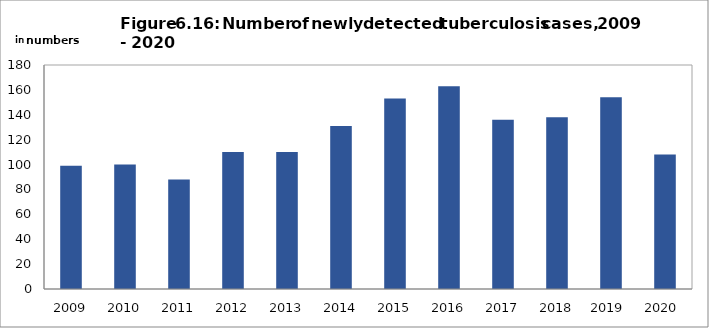
| Category | Series 0 |
|---|---|
| 2009.0 | 99 |
| 2010.0 | 100 |
| 2011.0 | 88 |
| 2012.0 | 110 |
| 2013.0 | 110 |
| 2014.0 | 131 |
| 2015.0 | 153 |
| 2016.0 | 163 |
| 2017.0 | 136 |
| 2018.0 | 138 |
| 2019.0 | 154 |
| 2020.0 | 108 |